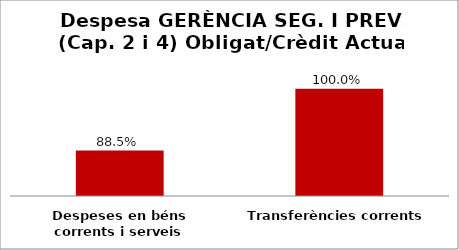
| Category | Series 0 |
|---|---|
| Despeses en béns corrents i serveis | 0.885 |
| Transferències corrents | 1 |